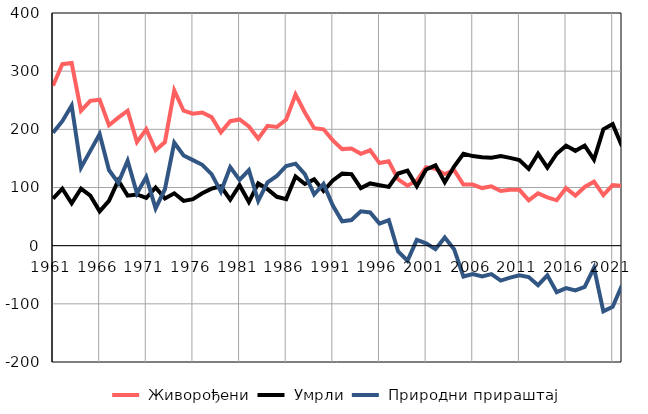
| Category |  Живорођени |  Умрли |  Природни прираштај |
|---|---|---|---|
| 1961.0 | 275 | 81 | 194 |
| 1962.0 | 312 | 98 | 214 |
| 1963.0 | 314 | 73 | 241 |
| 1964.0 | 232 | 98 | 134 |
| 1965.0 | 249 | 86 | 163 |
| 1966.0 | 251 | 59 | 192 |
| 1967.0 | 207 | 77 | 130 |
| 1968.0 | 220 | 112 | 108 |
| 1969.0 | 232 | 86 | 146 |
| 1970.0 | 178 | 88 | 90 |
| 1971.0 | 200 | 82 | 118 |
| 1972.0 | 164 | 100 | 64 |
| 1973.0 | 178 | 81 | 97 |
| 1974.0 | 267 | 90 | 177 |
| 1975.0 | 232 | 77 | 155 |
| 1976.0 | 227 | 80 | 147 |
| 1977.0 | 229 | 90 | 139 |
| 1978.0 | 221 | 98 | 123 |
| 1979.0 | 195 | 102 | 93 |
| 1980.0 | 214 | 79 | 135 |
| 1981.0 | 217 | 104 | 113 |
| 1982.0 | 205 | 75 | 130 |
| 1983.0 | 184 | 107 | 77 |
| 1984.0 | 206 | 97 | 109 |
| 1985.0 | 204 | 84 | 120 |
| 1986.0 | 217 | 80 | 137 |
| 1987.0 | 260 | 119 | 141 |
| 1988.0 | 229 | 106 | 123 |
| 1989.0 | 202 | 114 | 88 |
| 1990.0 | 200 | 94 | 106 |
| 1991.0 | 181 | 112 | 69 |
| 1992.0 | 166 | 124 | 42 |
| 1993.0 | 167 | 123 | 44 |
| 1994.0 | 158 | 99 | 59 |
| 1995.0 | 164 | 107 | 57 |
| 1996.0 | 142 | 104 | 38 |
| 1997.0 | 145 | 101 | 44 |
| 1998.0 | 114 | 124 | -10 |
| 1999.0 | 103 | 129 | -26 |
| 2000.0 | 112 | 102 | 10 |
| 2001.0 | 135 | 131 | 4 |
| 2002.0 | 132 | 138 | -6 |
| 2003.0 | 123 | 109 | 14 |
| 2004.0 | 130 | 136 | -6 |
| 2005.0 | 105 | 158 | -53 |
| 2006.0 | 105 | 154 | -49 |
| 2007.0 | 99 | 152 | -53 |
| 2008.0 | 102 | 151 | -49 |
| 2009.0 | 94 | 154 | -60 |
| 2010.0 | 96 | 151 | -55 |
| 2011.0 | 96 | 147 | -51 |
| 2012.0 | 78 | 132 | -54 |
| 2013.0 | 90 | 158 | -68 |
| 2014.0 | 83 | 134 | -51 |
| 2015.0 | 78 | 158 | -80 |
| 2016.0 | 99 | 172 | -73 |
| 2017.0 | 86 | 163 | -77 |
| 2018.0 | 101 | 172 | -71 |
| 2019.0 | 110 | 148 | -38 |
| 2020.0 | 87 | 200 | -113 |
| 2021.0 | 104 | 209 | -105 |
| 2022.0 | 103 | 171 | -68 |